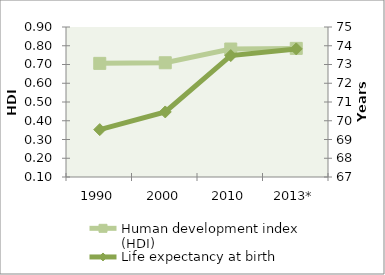
| Category | Human development index (HDI) |
|---|---|
| 1990 | 0.706 |
| 2000 | 0.709 |
| 2010 | 0.783 |
| 2013* | 0.786 |